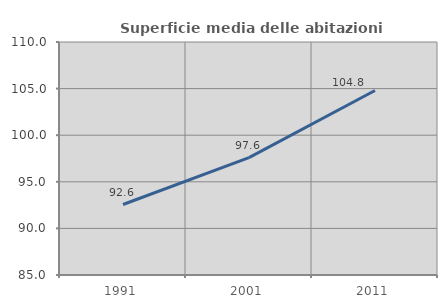
| Category | Superficie media delle abitazioni occupate |
|---|---|
| 1991.0 | 92.563 |
| 2001.0 | 97.595 |
| 2011.0 | 104.8 |